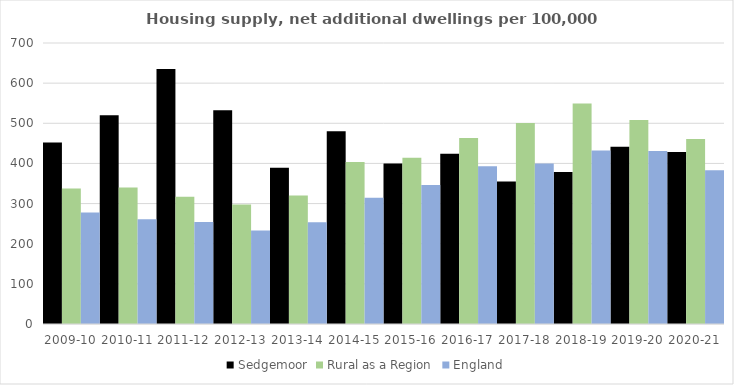
| Category | Sedgemoor | Rural as a Region | England |
|---|---|---|---|
| 2009-10 | 451.945 | 337.852 | 277.548 |
| 2010-11 | 519.748 | 340.105 | 260.994 |
| 2011-12 | 635.23 | 317.04 | 254.007 |
| 2012-13 | 532.451 | 297.763 | 233.153 |
| 2013-14 | 389.132 | 319.835 | 253.602 |
| 2014-15 | 479.997 | 403.796 | 314.256 |
| 2015-16 | 399.531 | 414.091 | 346.154 |
| 2016-17 | 424.41 | 463.209 | 393.256 |
| 2017-18 | 355.219 | 500.68 | 399.646 |
| 2018-19 | 378.692 | 549.491 | 432.099 |
| 2019-20 | 441.637 | 508.493 | 431.187 |
| 2020-21 | 428.527 | 461.114 | 382.827 |